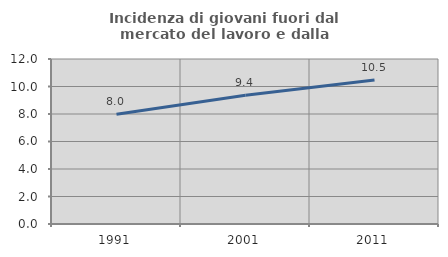
| Category | Incidenza di giovani fuori dal mercato del lavoro e dalla formazione  |
|---|---|
| 1991.0 | 7.989 |
| 2001.0 | 9.368 |
| 2011.0 | 10.476 |